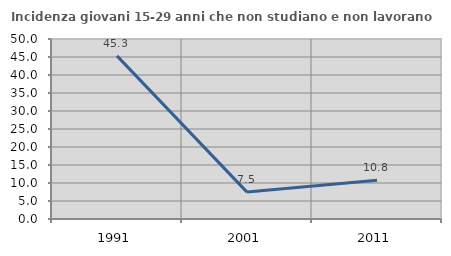
| Category | Incidenza giovani 15-29 anni che non studiano e non lavorano  |
|---|---|
| 1991.0 | 45.316 |
| 2001.0 | 7.47 |
| 2011.0 | 10.781 |